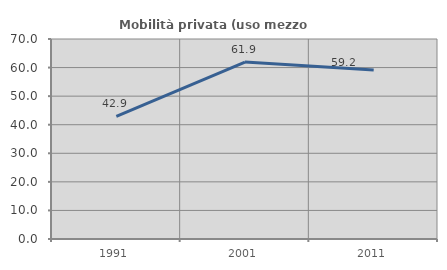
| Category | Mobilità privata (uso mezzo privato) |
|---|---|
| 1991.0 | 42.908 |
| 2001.0 | 61.946 |
| 2011.0 | 59.178 |